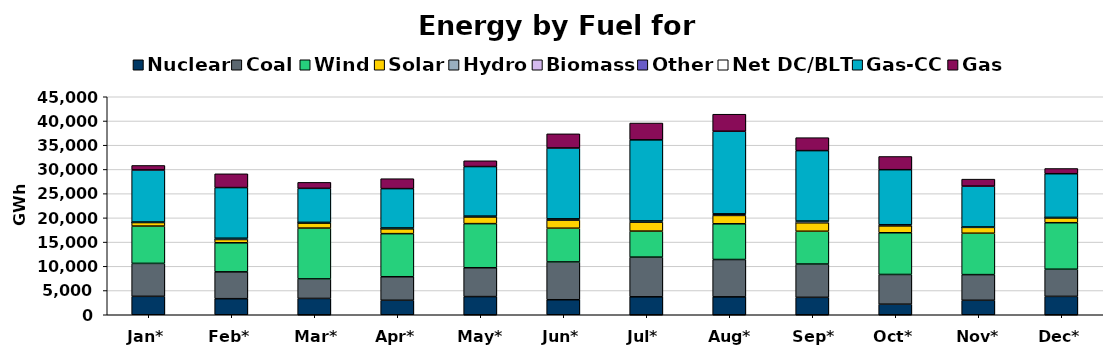
| Category | Nuclear | Coal | Wind | Solar | Hydro | Biomass | Other | Net DC/BLT | Gas-CC | Gas |
|---|---|---|---|---|---|---|---|---|---|---|
| Jan* | 3801 | 6803 | 7702 | 738 | 36 | 22 | 1 | 40 | 10744 | 934 |
| Feb* | 3317 | 5540 | 5996 | 686 | 56 | 17 | 14 | 171 | 10455 | 2843 |
| Mar* | 3369 | 4036 | 10483 | 1085 | 23 | 22 | -1 | 52 | 7023 | 1235 |
| Apr* | 2988 | 4859 | 8895 | 1023 | 51 | 19 | 2 | 80 | 8119 | 2053 |
| May* | 3748 | 5956 | 9104 | 1400 | 76 | 18 | -1 | 62 | 10228 | 1193 |
| Jun* | 3099 | 7804 | 6960 | 1694 | 77 | 29 | 0 | 137 | 14621 | 2925 |
| Jul* | 3705 | 8192 | 5370 | 1872 | 57 | 68 | -1 | 102 | 16735 | 3476 |
| Aug* | 3696 | 7706 | 7375 | 1726 | 56 | 75 | -2 | 198 | 17045 | 3520 |
| Sep* | 3595 | 6876 | 6767 | 1771 | 34 | 65 | -2 | 239 | 14538 | 2672 |
| Oct* | 2178 | 6140 | 8608 | 1456 | 18 | 65 | -1 | 117 | 11360 | 2730 |
| Nov* | 2984 | 5301 | 8543 | 1216 | 11 | 18 | 3 | 48 | 8425 | 1446 |
| Dec* | 3790 | 5611 | 9599 | 1043 | 9 | 17 | -3 | 22 | 9021 | 1078 |